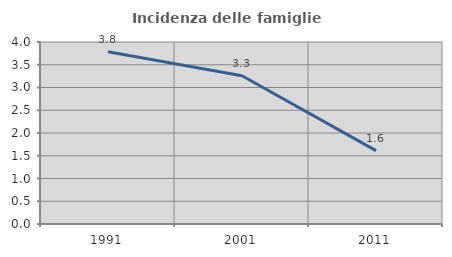
| Category | Incidenza delle famiglie numerose |
|---|---|
| 1991.0 | 3.787 |
| 2001.0 | 3.259 |
| 2011.0 | 1.613 |